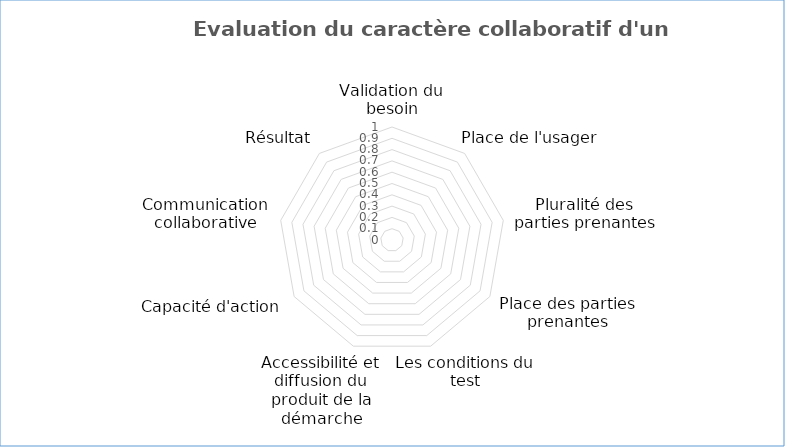
| Category | Series 0 |
|---|---|
| Validation du besoin | 0 |
| Place de l'usager | 0 |
| Pluralité des parties prenantes | 0 |
| Place des parties prenantes | 0 |
| Les conditions du test | 0 |
| Accessibilité et diffusion du produit de la démarche | 0 |
| Capacité d'action | 0 |
| Communication collaborative | 0 |
| Résultat | 0 |